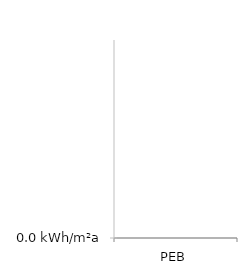
| Category | Series 0 | Series 1 |
|---|---|---|
| PEB | 0 | 0 |